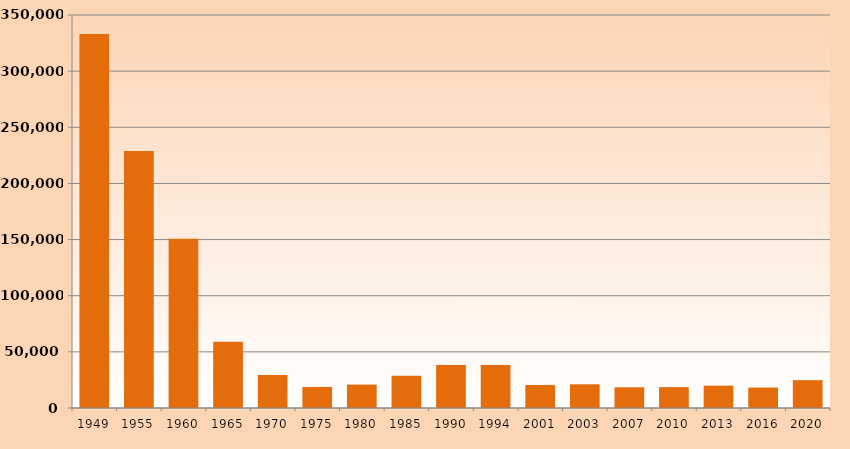
| Category | Series 1 |
|---|---|
| 1949.0 | 332988 |
| 1955.0 | 228906 |
| 1960.0 | 150735 |
| 1965.0 | 59032 |
| 1970.0 | 29494 |
| 1975.0 | 18742 |
| 1980.0 | 20827 |
| 1985.0 | 28741 |
| 1990.0 | 38205 |
| 1994.0 | 38330 |
| 2001.0 | 20518 |
| 2003.0 | 21106 |
| 2007.0 | 18412 |
| 2010.0 | 18598 |
| 2013.0 | 19900 |
| 2016.0 | 18212 |
| 2020.0 | 24753 |